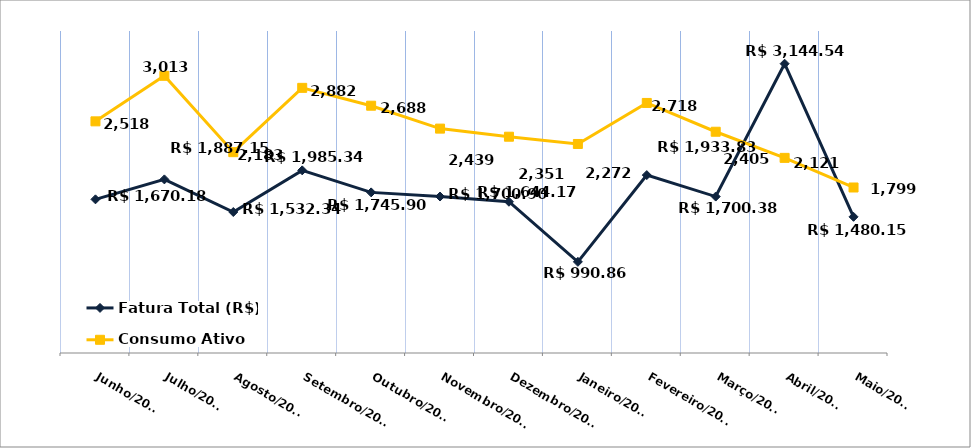
| Category | Fatura Total (R$) |
|---|---|
| Junho/2023 | 1670.18 |
| Julho/2023 | 1887.15 |
| Agosto/2023 | 1532.34 |
| Setembro/2023 | 1985.34 |
| Outubro/2023 | 1745.9 |
| Novembro/2023 | 1700.9 |
| Dezembro/2023 | 1644.17 |
| Janeiro/2024 | 990.86 |
| Fevereiro/2024 | 1933.83 |
| Março/2024 | 1700.38 |
| Abril/2024 | 3144.54 |
| Maio/2024 | 1480.15 |